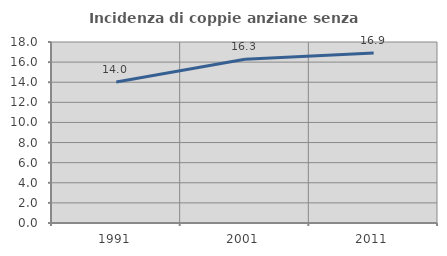
| Category | Incidenza di coppie anziane senza figli  |
|---|---|
| 1991.0 | 14.028 |
| 2001.0 | 16.289 |
| 2011.0 | 16.905 |